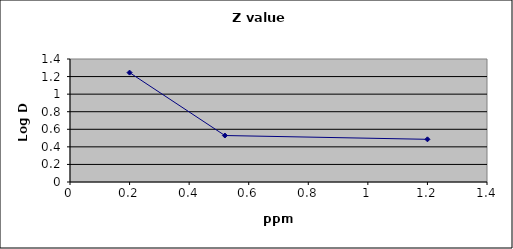
| Category | Series 0 |
|---|---|
| 1.2 | 0.486 |
| 0.52 | 0.529 |
| 0.2 | 1.245 |